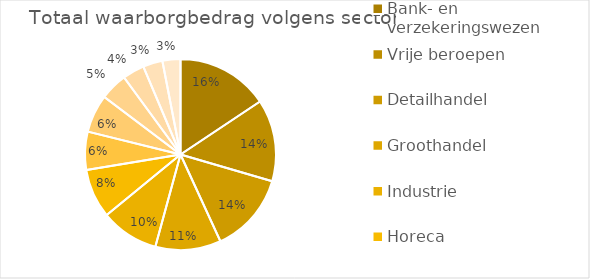
| Category | Q2 2017 |
|---|---|
| Bank- en verzekeringswezen | 94.597 |
| Vrije beroepen | 83.971 |
| Detailhandel | 82.352 |
| Groothandel | 67.083 |
| Industrie | 59.484 |
| Horeca | 50.32 |
| Informatie en communicatie | 39.059 |
| Bouwnijverheid | 38.976 |
| Administratieve en ondersteunende diensten | 28.036 |
| Vervoer en opslag | 22.403 |
| Kunst, amusement en recreatie | 20.041 |
| Automobielsector | 18.447 |